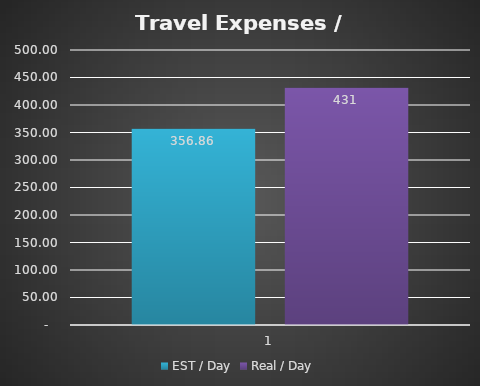
| Category | EST / Day  | Real / Day |
|---|---|---|
| 0 | 356.857 | 431.143 |